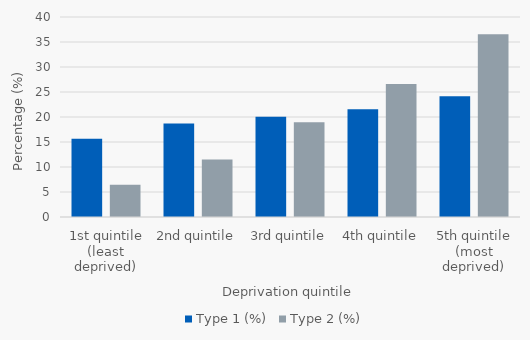
| Category | Type 1 (%) | Type 2 (%) |
|---|---|---|
| 1st quintile (least deprived) | 15.671 | 6.455 |
| 2nd quintile | 18.715 | 11.519 |
| 3rd quintile | 20.068 | 18.967 |
| 4th quintile | 21.533 | 26.614 |
| 5th quintile (most deprived) | 24.126 | 36.544 |